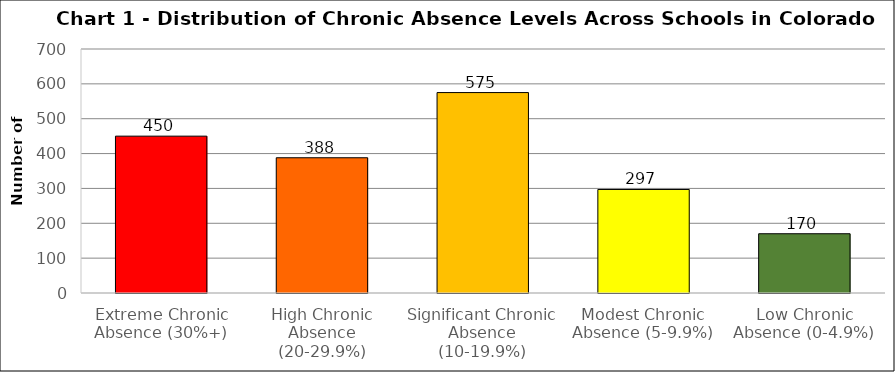
| Category | Series 0 |
|---|---|
| Extreme Chronic Absence (30%+) | 450 |
| High Chronic Absence (20-29.9%) | 388 |
| Significant Chronic Absence (10-19.9%) | 575 |
| Modest Chronic Absence (5-9.9%) | 297 |
| Low Chronic Absence (0-4.9%) | 170 |